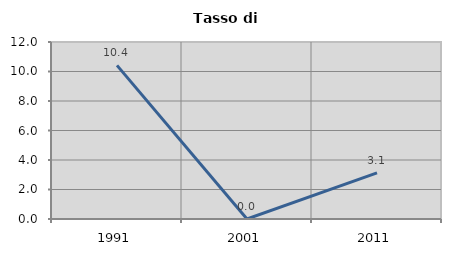
| Category | Tasso di disoccupazione   |
|---|---|
| 1991.0 | 10.417 |
| 2001.0 | 0 |
| 2011.0 | 3.125 |